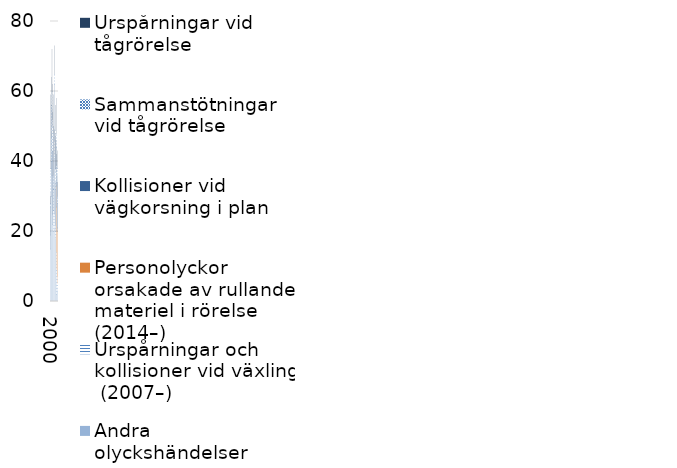
| Category | Andra olyckshändelser | Urspårningar och kollisioner vid växling  (2007–) | Personolyckor orsakade av rullande materiel i rörelse (2014–) | Kollisioner vid vägkorsning i plan | Sammanstötningar vid tågrörelse  | Urspårningar vid tågrörelse  |
|---|---|---|---|---|---|---|
| 2000 | 15 | 0 | 0 | 12 | 1 | 2 |
| 2001 | 19 | 0 | 0 | 12 | 7 | 21 |
| 2002 | 30 | 0 | 0 | 10 | 7 | 9 |
| 2003 | 38 | 0 | 0 | 10 | 8 | 8 |
| 2004 | 36 | 0 | 0 | 19 | 5 | 12 |
| 2005 | 22 | 0 | 0 | 21 | 9 | 2 |
| 2006 | 25 | 0 | 0 | 18 | 7 | 12 |
| 2007 | 26 | 6 | 0 | 15 | 1 | 11 |
| 2008 | 20 | 6 | 0 | 6 | 4 | 14 |
| 2009 | 21 | 4 | 0 | 16 | 1 | 7 |
| 2010 | 41 | 5 | 0 | 16 | 3 | 8 |
| 2011 | 32 | 6 | 0 | 9 | 2 | 7 |
| 2012 | 18 | 4 | 0 | 12 | 4 | 10 |
| 2013 | 19 | 1 | 0 | 14 | 3 | 9 |
| 2014 | 9 | 5 | 19 | 11 | 4 | 10 |
| 2015 | 2 | 7 | 18 | 9 | 3 | 3 |
| 2016 | 4 | 1 | 16 | 7 | 2 | 4 |
| 2017 | 3 | 4 | 13 | 16 | 2 | 5 |